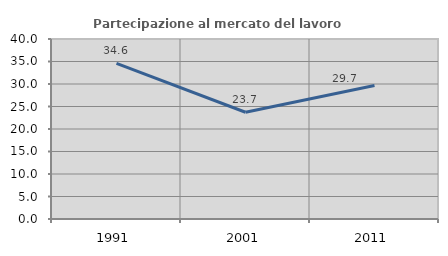
| Category | Partecipazione al mercato del lavoro  femminile |
|---|---|
| 1991.0 | 34.566 |
| 2001.0 | 23.718 |
| 2011.0 | 29.653 |